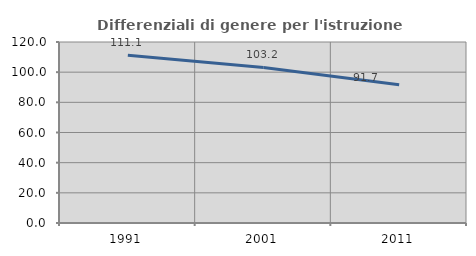
| Category | Differenziali di genere per l'istruzione superiore |
|---|---|
| 1991.0 | 111.137 |
| 2001.0 | 103.152 |
| 2011.0 | 91.651 |